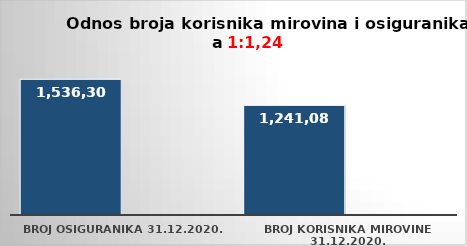
| Category | Series 0 | Series 1 |
|---|---|---|
| broj osiguranika 31.12.2020. | 1536300 |  |
| broj korisnika mirovine 31.12.2020. | 1241085 |  |